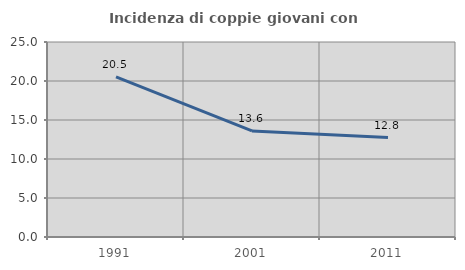
| Category | Incidenza di coppie giovani con figli |
|---|---|
| 1991.0 | 20.522 |
| 2001.0 | 13.605 |
| 2011.0 | 12.754 |